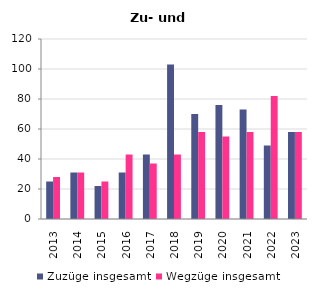
| Category | Zuzüge insgesamt | Wegzüge insgesamt |
|---|---|---|
| 2013.0 | 25 | 28 |
| 2014.0 | 31 | 31 |
| 2015.0 | 22 | 25 |
| 2016.0 | 31 | 43 |
| 2017.0 | 43 | 37 |
| 2018.0 | 103 | 43 |
| 2019.0 | 70 | 58 |
| 2020.0 | 76 | 55 |
| 2021.0 | 73 | 58 |
| 2022.0 | 49 | 82 |
| 2023.0 | 58 | 58 |